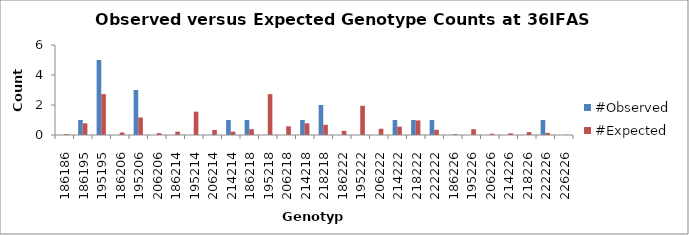
| Category | #Observed | #Expected |
|---|---|---|
| 186186.0 | 0 | 0.056 |
| 186195.0 | 1 | 0.778 |
| 195195.0 | 5 | 2.722 |
| 186206.0 | 0 | 0.167 |
| 195206.0 | 3 | 1.167 |
| 206206.0 | 0 | 0.125 |
| 186214.0 | 0 | 0.222 |
| 195214.0 | 0 | 1.556 |
| 206214.0 | 0 | 0.333 |
| 214214.0 | 1 | 0.222 |
| 186218.0 | 1 | 0.389 |
| 195218.0 | 0 | 2.722 |
| 206218.0 | 0 | 0.583 |
| 214218.0 | 1 | 0.778 |
| 218218.0 | 2 | 0.681 |
| 186222.0 | 0 | 0.278 |
| 195222.0 | 0 | 1.944 |
| 206222.0 | 0 | 0.417 |
| 214222.0 | 1 | 0.556 |
| 218222.0 | 1 | 0.972 |
| 222222.0 | 1 | 0.347 |
| 186226.0 | 0 | 0.056 |
| 195226.0 | 0 | 0.389 |
| 206226.0 | 0 | 0.083 |
| 214226.0 | 0 | 0.111 |
| 218226.0 | 0 | 0.194 |
| 222226.0 | 1 | 0.139 |
| 226226.0 | 0 | 0.014 |